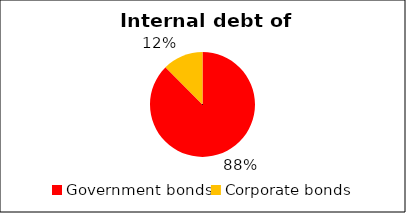
| Category | Domestic bond market volume |
|---|---|
| Government bonds | 1.584 |
| Corporate bonds | 0.226 |